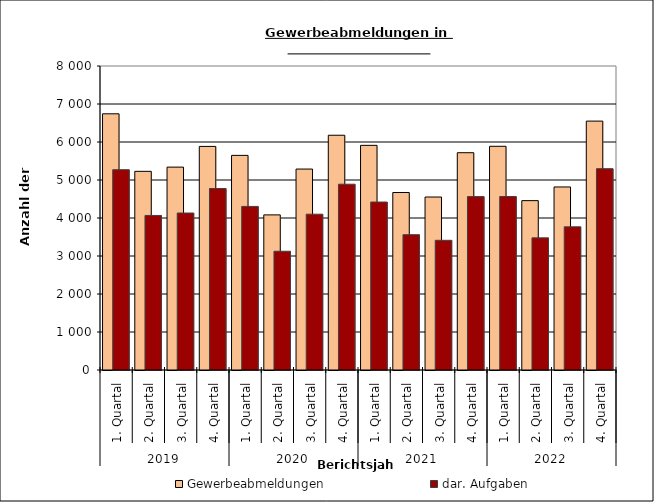
| Category | Gewerbeabmeldungen | dar. Aufgaben |
|---|---|---|
| 0 | 6742 | 5271 |
| 1 | 5228 | 4067 |
| 2 | 5339 | 4131 |
| 3 | 5884 | 4776 |
| 4 | 5648 | 4305 |
| 5 | 4082 | 3125 |
| 6 | 5288 | 4100 |
| 7 | 6178 | 4889 |
| 8 | 5912 | 4420 |
| 9 | 4671 | 3561 |
| 10 | 4552 | 3413 |
| 11 | 5718 | 4563 |
| 12 | 5887 | 4566 |
| 13 | 4457 | 3477 |
| 14 | 4817 | 3768 |
| 15 | 6550 | 5298 |